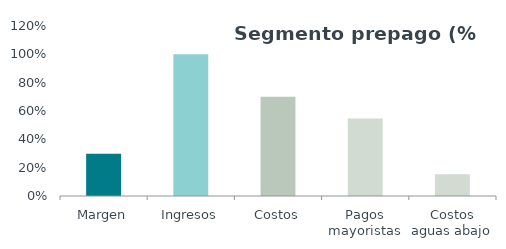
| Category | Series 0 |
|---|---|
| Margen | 0.299 |
| Ingresos | 1 |
| Costos | 0.701 |
| Pagos mayoristas | 0.547 |
| Costos aguas abajo | 0.154 |